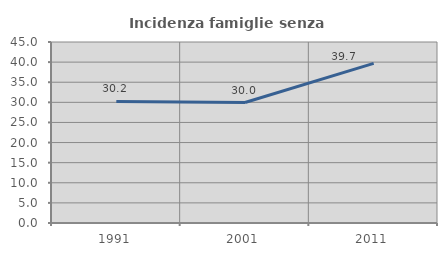
| Category | Incidenza famiglie senza nuclei |
|---|---|
| 1991.0 | 30.233 |
| 2001.0 | 29.954 |
| 2011.0 | 39.686 |